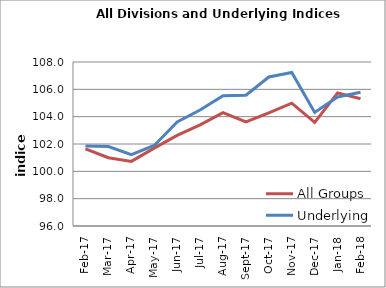
| Category | All Groups | Underlying |
|---|---|---|
| 2017-02-01 | 101.644 | 101.858 |
| 2017-03-01 | 100.999 | 101.809 |
| 2017-04-01 | 100.727 | 101.214 |
| 2017-05-01 | 101.699 | 101.894 |
| 2017-06-01 | 102.633 | 103.613 |
| 2017-07-01 | 103.397 | 104.483 |
| 2017-08-01 | 104.291 | 105.536 |
| 2017-09-01 | 103.612 | 105.565 |
| 2017-10-01 | 104.27 | 106.905 |
| 2017-11-01 | 104.991 | 107.237 |
| 2017-12-01 | 103.588 | 104.31 |
| 2018-01-01 | 105.739 | 105.443 |
| 2018-02-01 | 105.308 | 105.79 |